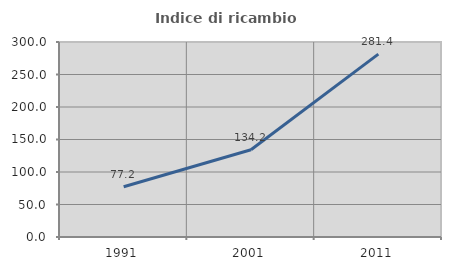
| Category | Indice di ricambio occupazionale  |
|---|---|
| 1991.0 | 77.224 |
| 2001.0 | 134.203 |
| 2011.0 | 281.388 |